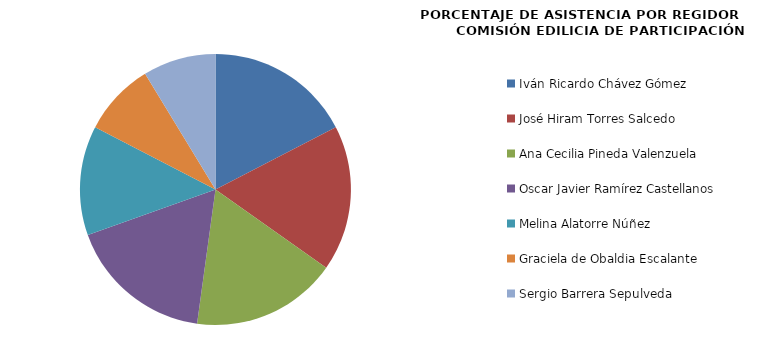
| Category | Series 0 |
|---|---|
| Iván Ricardo Chávez Gómez | 100 |
| José Hiram Torres Salcedo | 100 |
| Ana Cecilia Pineda Valenzuela | 100 |
| Oscar Javier Ramírez Castellanos | 100 |
| Melina Alatorre Núñez | 75 |
| Graciela de Obaldia Escalante | 50 |
| Sergio Barrera Sepulveda | 50 |